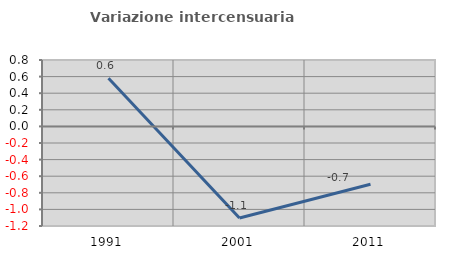
| Category | Variazione intercensuaria annua |
|---|---|
| 1991.0 | 0.579 |
| 2001.0 | -1.104 |
| 2011.0 | -0.697 |